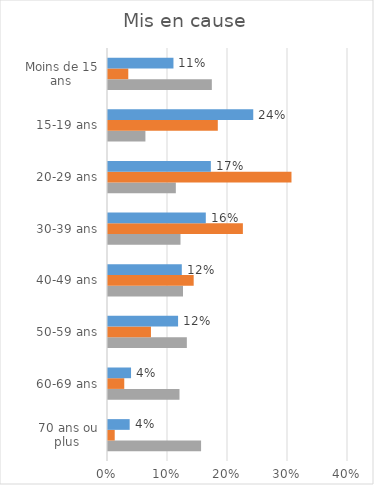
| Category | Mis en cause |
|---|---|
| 70 ans ou plus  | 0.036 |
| 60-69 ans | 0.038 |
| 50-59 ans | 0.117 |
| 40-49 ans | 0.123 |
| 30-39 ans | 0.163 |
| 20-29 ans | 0.171 |
| 15-19 ans | 0.242 |
| Moins de 15 ans | 0.109 |